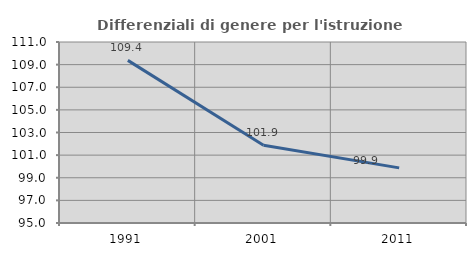
| Category | Differenziali di genere per l'istruzione superiore |
|---|---|
| 1991.0 | 109.376 |
| 2001.0 | 101.87 |
| 2011.0 | 99.873 |